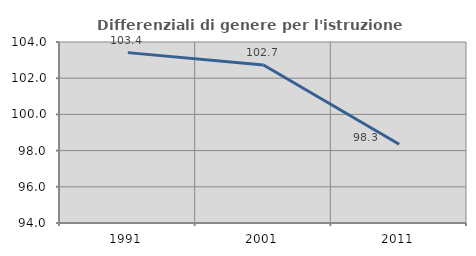
| Category | Differenziali di genere per l'istruzione superiore |
|---|---|
| 1991.0 | 103.413 |
| 2001.0 | 102.726 |
| 2011.0 | 98.348 |